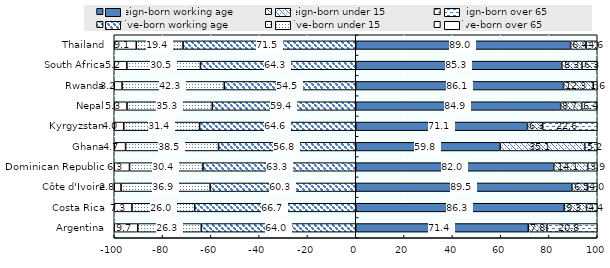
| Category | Foreign-born working age | Foreign-born under 15 | Foreign-born over 65 | Native-born working age | Native-born under 15 | Native-born over 65 |
|---|---|---|---|---|---|---|
| Argentina | 71.405 | 7.769 | 20.826 | -63.952 | -26.316 | -9.732 |
| Costa Rica | 86.28 | 9.29 | 4.43 | -66.68 | -26 | -7.26 |
| Côte d'Ivoire | 89.5 | 6.5 | 4 | -60.3 | -36.9 | -2.8 |
| Dominican Republic | 82.005 | 14.063 | 3.93 | -63.259 | -30.425 | -6.316 |
| Ghana | 59.771 | 35.076 | 5.152 | -56.812 | -38.491 | -4.698 |
| Kyrgyzstan | 71.127 | 6.253 | 22.62 | -64.641 | -31.401 | -3.958 |
| Nepal | 84.866 | 8.701 | 6.432 | -59.419 | -35.313 | -5.268 |
| Rwanda | 86.06 | 12.308 | 1.632 | -54.459 | -42.312 | -3.229 |
| South Africa | 85.335 | 8.35 | 6.315 | -64.299 | -30.479 | -5.221 |
| Thailand | 88.966 | 6.416 | 4.618 | -71.52 | -19.354 | -9.125 |